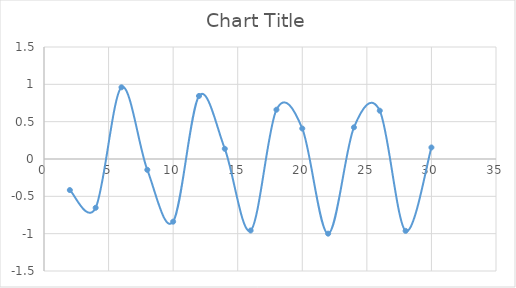
| Category | Series 0 |
|---|---|
| 2.0 | -0.416 |
| 4.0 | -0.654 |
| 6.0 | 0.96 |
| 8.0 | -0.146 |
| 10.0 | -0.839 |
| 12.0 | 0.844 |
| 14.0 | 0.137 |
| 16.0 | -0.958 |
| 18.0 | 0.66 |
| 20.0 | 0.408 |
| 22.0 | -1 |
| 24.0 | 0.424 |
| 26.0 | 0.647 |
| 28.0 | -0.963 |
| 30.0 | 0.154 |